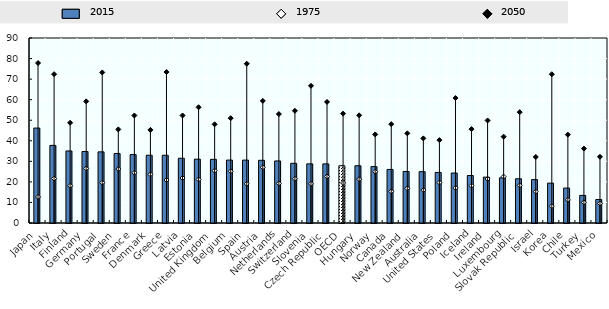
| Category | 2015 |
|---|---|
| Japan | 46.191 |
| Italy | 37.76 |
| Finland | 35.047 |
| Germany | 34.765 |
| Portugal | 34.614 |
| Sweden | 33.832 |
| France | 33.284 |
| Denmark | 32.968 |
| Greece | 32.959 |
| Latvia | 31.506 |
| Estonia | 31.048 |
| United Kingdom | 30.969 |
| Belgium | 30.611 |
| Spain | 30.597 |
| Austria | 30.498 |
| Netherlands | 30.187 |
| Switzerland | 29.033 |
| Slovenia | 28.773 |
| Czech Republic | 28.755 |
| OECD | 27.856 |
| Hungary | 27.85 |
| Norway | 27.422 |
| Canada | 26.05 |
| New Zealand | 25.051 |
| Australia | 24.975 |
| United States | 24.61 |
| Poland | 24.311 |
| Iceland | 23.11 |
| Ireland | 22.315 |
| Luxembourg | 21.99 |
| Slovak Republic | 21.518 |
| Israel | 21.107 |
| Korea | 19.391 |
| Chile | 17.011 |
| Turkey | 13.43 |
| Mexico | 11.431 |